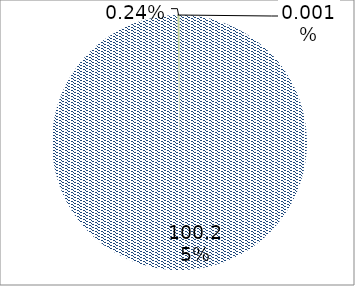
| Category | Series 0 |
|---|---|
| Fixed-line phone | 7513954539 |
| Cable Modem | 0 |
| DSL | 0 |
| FTTH/B | 0 |
| OtherInternet/unidntf. | 98776 |
| 1Gmobile analog voice | 18361070 |
| 2 G mobile voice | 0 |
| 2.5G mobile voice | 0 |
| 3G mobile voice | 0 |
| 2G mobile data | 0 |
| 2.5G mobile data | 0 |
| 3G mobile data | 0 |